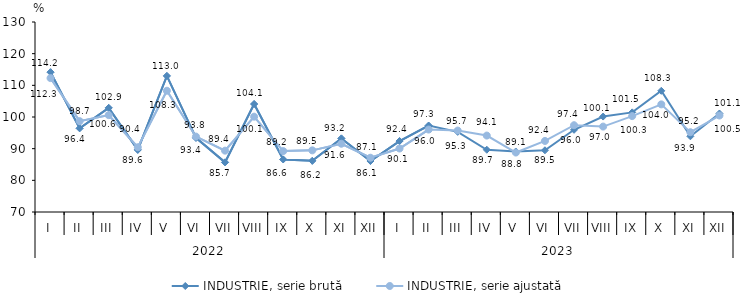
| Category | INDUSTRIE, serie brută | INDUSTRIE, serie ajustată |
|---|---|---|
| 0 | 114.151 | 112.283 |
| 1 | 96.419 | 98.68 |
| 2 | 102.886 | 100.594 |
| 3 | 89.614 | 90.447 |
| 4 | 112.973 | 108.294 |
| 5 | 93.417 | 93.82 |
| 6 | 85.678 | 89.372 |
| 7 | 104.099 | 100.102 |
| 8 | 86.603 | 89.228 |
| 9 | 86.164 | 89.466 |
| 10 | 93.241 | 91.558 |
| 11 | 86.103 | 87.134 |
| 12 | 92.401 | 90.061 |
| 13 | 97.289 | 96.037 |
| 14 | 95.308 | 95.715 |
| 15 | 89.66 | 94.137 |
| 16 | 89.107 | 88.779 |
| 17 | 89.487 | 92.437 |
| 18 | 95.957 | 97.406 |
| 19 | 100.143 | 96.975 |
| 20 | 101.463 | 100.289 |
| 21 | 108.274 | 103.99 |
| 22 | 93.901 | 95.195 |
| 23 | 101.109 | 100.47 |